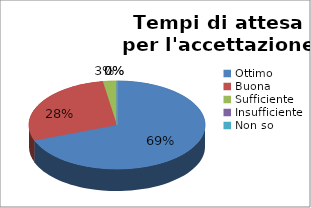
| Category | Tempi di attesa per l'accettazione |
|---|---|
| Ottimo | 27 |
| Buona | 11 |
| Sufficiente | 1 |
| Insufficiente | 0 |
| Non so | 0 |